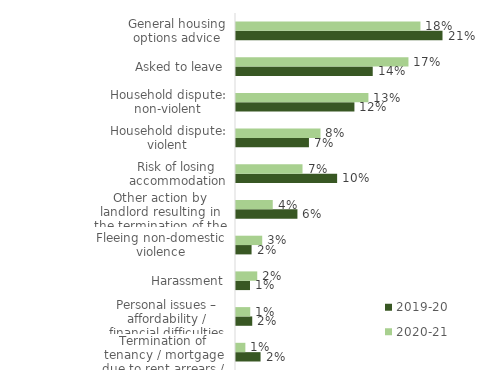
| Category | 2019-20 | 2020-21 |
|---|---|---|
| Termination of tenancy / mortgage due to rent arrears / default on payments | 0.025 | 0.009 |
| Personal issues – affordability / financial difficulties | 0.016 | 0.014 |
| Harassment | 0.014 | 0.021 |
| Fleeing non-domestic violence | 0.016 | 0.026 |
| Other action by landlord resulting in the termination of the tenancy | 0.061 | 0.037 |
| Risk of losing accommodation | 0.101 | 0.067 |
| Household dispute: violent | 0.073 | 0.084 |
| Household dispute: non-violent | 0.118 | 0.132 |
| Asked to leave | 0.137 | 0.172 |
| General housing options advice | 0.207 | 0.184 |